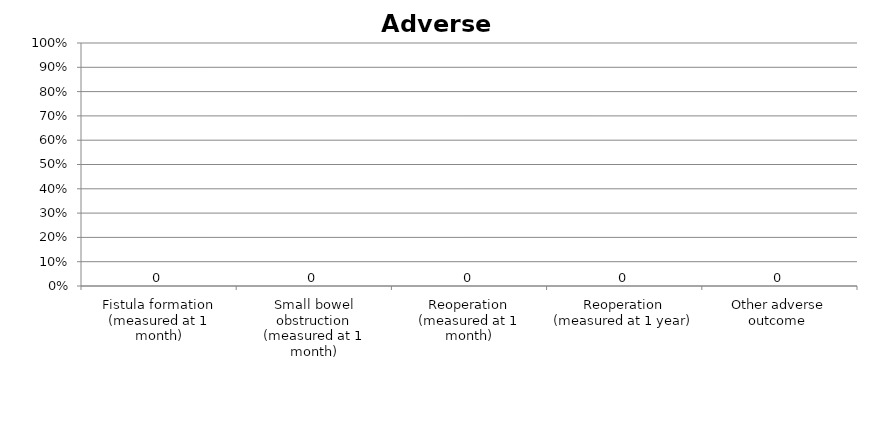
| Category | Series 0 |
|---|---|
| Fistula formation (measured at 1 month) | 0 |
| Small bowel obstruction (measured at 1 month) | 0 |
| Reoperation (measured at 1 month) | 0 |
| Reoperation (measured at 1 year) | 0 |
| Other adverse outcome  | 0 |